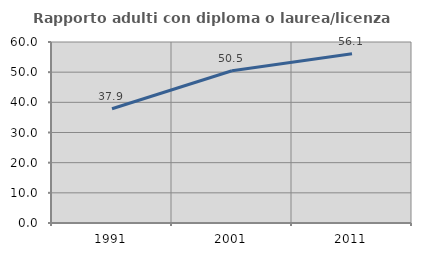
| Category | Rapporto adulti con diploma o laurea/licenza media  |
|---|---|
| 1991.0 | 37.888 |
| 2001.0 | 50.455 |
| 2011.0 | 56.14 |